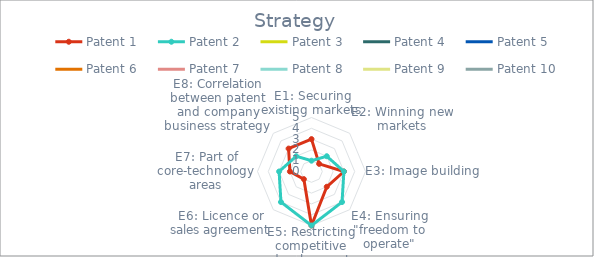
| Category | Patent 1 | Patent 2 | Patent 3 | Patent 4 | Patent 5 | Patent 6 | Patent 7 | Patent 8 | Patent 9 | Patent 10 |
|---|---|---|---|---|---|---|---|---|---|---|
| E1: Securing existing markets | 3 | 1 | 0 | 0 | 0 | 0 | 0 | 0 | 0 | 0 |
| E2: Winning new markets | 1 | 2 | 0 | 0 | 0 | 0 | 0 | 0 | 0 | 0 |
| E3: Image building | 3 | 3 | 0 | 0 | 0 | 0 | 0 | 0 | 0 | 0 |
| E4: Ensuring "freedom to operate" | 2 | 4 | 0 | 0 | 0 | 0 | 0 | 0 | 0 | 0 |
| E5: Restricting competitive development | 5 | 5 | 0 | 0 | 0 | 0 | 0 | 0 | 0 | 0 |
| E6: Licence or sales agreement | 1 | 4 | 0 | 0 | 0 | 0 | 0 | 0 | 0 | 0 |
| E7: Part of core-technology areas | 2 | 3 | 0 | 0 | 0 | 0 | 0 | 0 | 0 | 0 |
| E8: Correlation between patent and company business strategy | 3 | 2 | 0 | 0 | 0 | 0 | 0 | 0 | 0 | 0 |